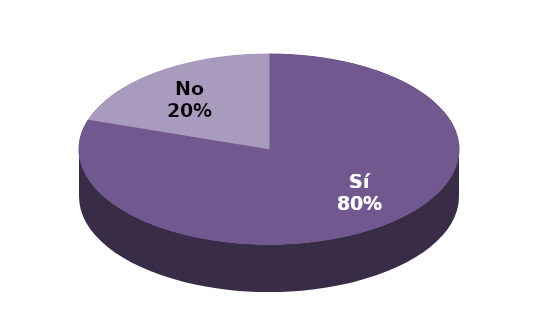
| Category | Series 1 |
|---|---|
| Sí | 12 |
| No | 3 |